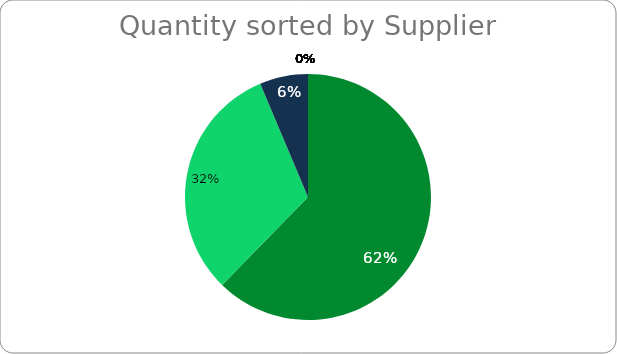
| Category | Series 0 |
|---|---|
| Supplier X | 314 |
| Supplier Y | 158 |
| Supplier Z | 32 |